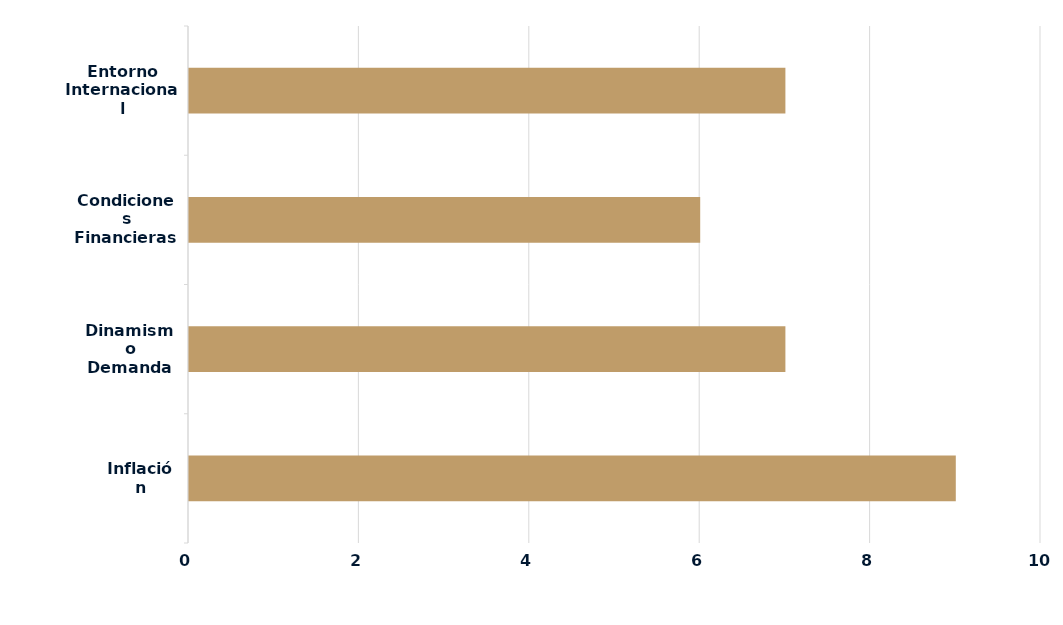
| Category | Series 0 |
|---|---|
| Inflación | 9 |
| Dinamismo Demanda | 7 |
| Condiciones Financieras Locales | 6 |
| Entorno Internacional | 7 |